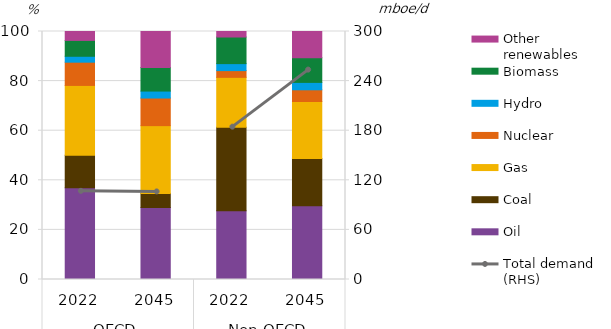
| Category | Oil | Coal | Gas | Nuclear | Hydro  | Biomass | Other renewables |
|---|---|---|---|---|---|---|---|
| 0 | 37.024 | 13.095 | 28.137 | 9.374 | 2.378 | 6.396 | 3.595 |
| 1 | 29.043 | 5.678 | 27.321 | 11.133 | 2.803 | 9.487 | 14.535 |
| 2 | 27.772 | 33.625 | 20.114 | 2.718 | 2.821 | 10.728 | 2.223 |
| 3 | 29.731 | 19.098 | 22.933 | 4.732 | 2.981 | 9.944 | 10.581 |